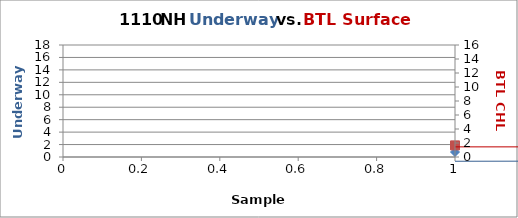
| Category |  FL |
|---|---|
| 0 | 0.802 |
| 1 | 8.002 |
| 2 | 1.424 |
| 3 | 2.659 |
| 4 | 0.55 |
| 5 | 0.623 |
| 6 | 0.641 |
| 7 | 0.479 |
| 8 | 0.797 |
| 9 | 0.532 |
| 10 | 0.494 |
| 11 | 0.342 |
| 12 | 0.183 |
| 13 | 0.242 |
| 14 | 0.232 |
| 15 | 0.216 |
| 16 | 0.22 |
| 17 | 0.102 |
| 18 | 0.058 |
| 19 | 0.094 |
| 20 | 0.102 |
| 21 | 0.14 |
| 22 | 0.19 |
| 23 | 0.17 |
| 24 | 0.246 |
| 25 | 0.208 |
| 26 | 0.648 |
| 27 | 0.443 |
| 28 | 1.018 |
| 29 | 0.608 |
| 30 | 0.636 |
| 31 | 1.398 |
| 32 | 1.916 |
| 33 | 1.6 |
| 34 | 1.513 |
| 35 | 4.35 |
| 36 | 0.864 |
| 37 | 1.341 |
| 38 | 15.446 |
| 39 | 0.694 |
| 40 | 0.606 |
| 41 | 0.203 |
| 42 | 0.198 |
| 43 | 0.364 |
| 44 | 0.196 |
| 45 | 0.446 |
| 46 | 0.474 |
| 47 | 0.336 |
| 48 | 0.357 |
| 49 | 0.792 |
| 50 | 0.997 |
| 51 | 0.706 |
| 52 | 2.435 |
| 53 | 2.416 |
| 54 | 3.766 |
| 55 | 1.854 |
| 56 | 1.962 |
| 57 | 3.039 |
| 58 | 2.429 |
| 59 | 4.663 |
| 60 | 4.256 |
| 61 | 3.257 |
| 62 | 2.62 |
| 63 | 2.636 |
| 64 | 2.674 |
| 65 | 3.442 |
| 66 | 4.356 |
| 67 | 4.512 |
| 68 | 6.184 |
| 69 | 6.787 |
| 70 | 8.326 |
| 71 | 9.63 |
| 72 | 9.626 |
| 73 | 9.682 |
| 74 | 11.237 |
| 75 | 11.614 |